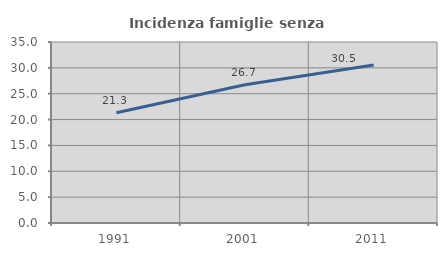
| Category | Incidenza famiglie senza nuclei |
|---|---|
| 1991.0 | 21.318 |
| 2001.0 | 26.734 |
| 2011.0 | 30.549 |